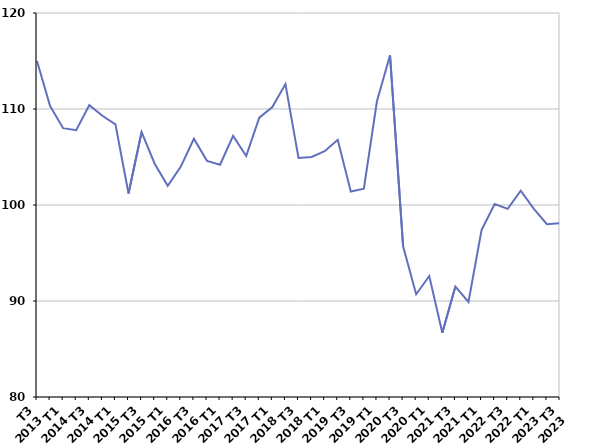
| Category | Fin de contrat |
|---|---|
| T3
2013 | 115 |
| T4
2013 | 110.3 |
| T1
2014 | 108 |
| T2
2014 | 107.8 |
| T3
2014 | 110.4 |
| T4
2014 | 109.3 |
| T1
2015 | 108.4 |
| T2
2015 | 101.2 |
| T3
2015 | 107.6 |
| T4
2015 | 104.3 |
| T1
2016 | 102 |
| T2
2016 | 104 |
| T3
2016 | 106.9 |
| T4
2016 | 104.6 |
| T1
2017 | 104.2 |
| T2
2017 | 107.2 |
| T3
2017 | 105.1 |
| T4
2017 | 109.1 |
| T1
2018 | 110.2 |
| T2
2018 | 112.6 |
| T3
2018 | 104.9 |
| T4
2018 | 105 |
| T1
2019 | 105.6 |
| T2
2019 | 106.8 |
| T3
2019 | 101.4 |
| T4
2019 | 101.7 |
| T1
2020 | 110.8 |
| T2
2020 | 115.6 |
| T3
2020 | 95.7 |
| T4
2020 | 90.7 |
| T1
2021 | 92.6 |
| T2
2021 | 86.7 |
| T3
2021 | 91.5 |
| T4
2021 | 89.9 |
| T1
2022 | 97.4 |
| T2
2022 | 100.1 |
| T3
2022 | 99.6 |
| T4
2022 | 101.5 |
| T1
2023 | 99.6 |
| T2
2023 | 98 |
| T3
2023 | 98.1 |